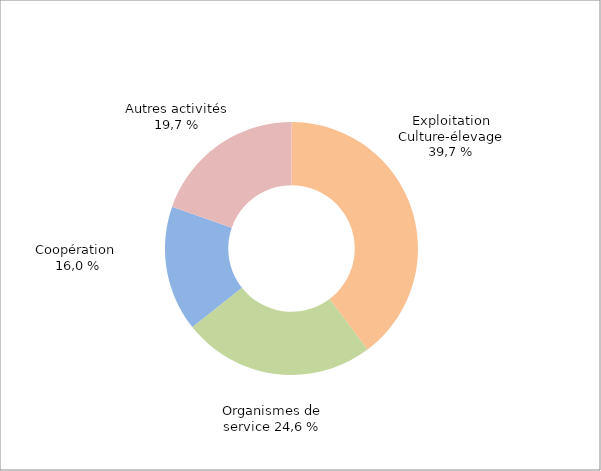
| Category | 2021 |
|---|---|
| Exploitation Culture-élevage | 546 |
| Organismes de service | 338 |
| Coopération | 220 |
| Autres activités | 270 |